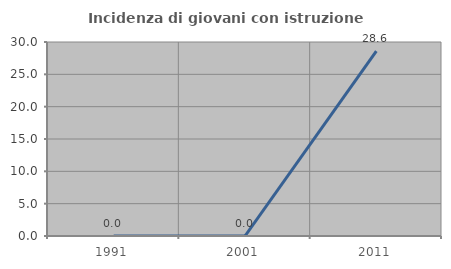
| Category | Incidenza di giovani con istruzione universitaria |
|---|---|
| 1991.0 | 0 |
| 2001.0 | 0 |
| 2011.0 | 28.571 |